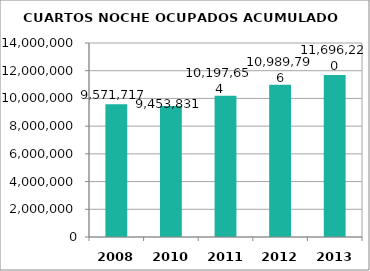
| Category | CUARTOS NOCHE OCUPADOS ACUMULADO |
|---|---|
| 2008.0 | 9571717 |
| 2010.0 | 9453831 |
| 2011.0 | 10197654 |
| 2012.0 | 10989796 |
| 2013.0 | 11696220 |